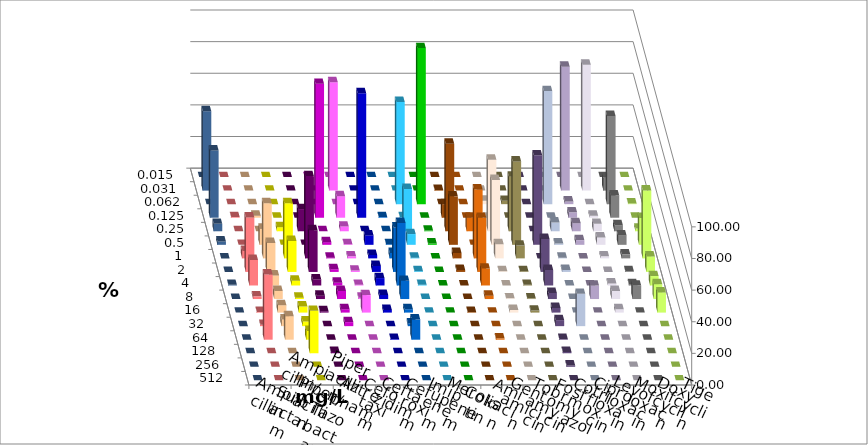
| Category | Ampicillin | Ampicillin/ Sulbactam | Piperacillin | Piperacillin/ Tazobactam | Aztreonam | Cefotaxim | Ceftazidim | Cefuroxim | Imipenem | Meropenem | Colistin | Amikacin | Gentamicin | Tobramycin | Fosfomycin | Cotrimoxazol | Ciprofloxacin | Levofloxacin | Moxifloxacin | Doxycyclin | Tigecyclin |
|---|---|---|---|---|---|---|---|---|---|---|---|---|---|---|---|---|---|---|---|---|---|
| 0.015 | 0 | 0 | 0 | 0 | 0 | 0 | 0 | 0 | 0 | 0 | 0 | 0 | 0 | 0 | 0 | 0 | 0 | 0 | 0 | 0 | 0 |
| 0.031 | 0 | 0 | 0 | 0 | 0 | 68.511 | 0 | 0 | 0 | 0 | 0.426 | 0 | 0 | 0 | 0 | 0 | 78.298 | 79.574 | 8.085 | 0 | 50.213 |
| 0.062 | 0 | 0 | 0 | 0 | 0 | 0 | 0 | 0 | 64.681 | 98.718 | 0 | 0 | 2.137 | 2.128 | 0 | 71.489 | 1.702 | 0 | 55.745 | 0.426 | 0 |
| 0.125 | 0.426 | 1.277 | 0 | 0 | 84.681 | 13.617 | 78.723 | 0.426 | 0.426 | 0 | 8.511 | 0 | 0 | 0 | 0 | 0 | 3.404 | 1.277 | 14.043 | 0 | 42.553 |
| 0.25 | 0 | 0 | 2.553 | 14.043 | 0 | 2.979 | 0 | 0 | 26.809 | 0.427 | 55.319 | 8.547 | 45.299 | 34.468 | 0 | 5.532 | 5.106 | 4.681 | 3.83 | 1.702 | 4.681 |
| 0.5 | 0 | 10.213 | 0 | 0 | 1.702 | 0.426 | 5.957 | 0.426 | 6.809 | 0.855 | 30.638 | 0 | 41.026 | 52.766 | 56.596 | 0.851 | 2.979 | 4.681 | 5.957 | 17.021 | 2.128 |
| 1.0 | 4.681 | 34.894 | 34.894 | 51.915 | 0.426 | 1.277 | 2.128 | 3.404 | 0.426 | 0 | 3.404 | 43.59 | 8.974 | 8.085 | 0 | 0.426 | 0 | 1.277 | 2.553 | 42.979 | 0 |
| 2.0 | 34.468 | 18.298 | 19.574 | 26.383 | 1.702 | 0.851 | 3.83 | 28.085 | 0.426 | 0 | 1.277 | 34.188 | 0.427 | 0.426 | 20.851 | 1.277 | 0 | 0 | 0.426 | 9.787 | 0 |
| 4.0 | 16.17 | 6.383 | 2.979 | 3.83 | 1.702 | 0.426 | 4.681 | 39.574 | 0.426 | 0 | 0 | 10.684 | 0 | 0.426 | 9.787 | 0 | 0 | 1.277 | 0.851 | 5.957 | 0.426 |
| 8.0 | 1.702 | 5.106 | 0.851 | 2.128 | 5.106 | 0.851 | 2.553 | 11.489 | 0 | 0 | 0 | 2.137 | 0.427 | 0.426 | 3.83 | 0 | 8.511 | 5.106 | 8.511 | 9.362 | 0 |
| 16.0 | 0.426 | 4.681 | 3.83 | 0.851 | 2.128 | 11.064 | 1.702 | 2.128 | 0 | 0 | 0.426 | 0 | 1.709 | 1.277 | 2.979 | 0 | 0 | 2.128 | 0 | 12.766 | 0 |
| 32.0 | 0.851 | 4.255 | 2.979 | 0 | 2.553 | 0 | 0 | 1.702 | 0 | 0 | 0 | 0 | 0 | 0 | 3.83 | 20.426 | 0 | 0 | 0 | 0 | 0 |
| 64.0 | 41.277 | 14.894 | 5.532 | 0 | 0 | 0 | 0.426 | 12.766 | 0 | 0 | 0 | 0.855 | 0 | 0 | 0.426 | 0 | 0 | 0 | 0 | 0 | 0 |
| 128.0 | 0 | 0 | 26.809 | 0.851 | 0 | 0 | 0 | 0 | 0 | 0 | 0 | 0 | 0 | 0 | 0.851 | 0 | 0 | 0 | 0 | 0 | 0 |
| 256.0 | 0 | 0 | 0 | 0 | 0 | 0 | 0 | 0 | 0 | 0 | 0 | 0 | 0 | 0 | 0.851 | 0 | 0 | 0 | 0 | 0 | 0 |
| 512.0 | 0 | 0 | 0 | 0 | 0 | 0 | 0 | 0 | 0 | 0 | 0 | 0 | 0 | 0 | 0 | 0 | 0 | 0 | 0 | 0 | 0 |